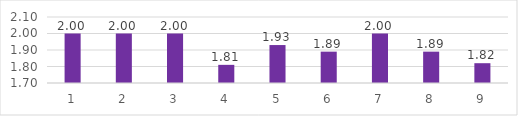
| Category | Series 0 |
|---|---|
| 0 | 2 |
| 1 | 2 |
| 2 | 2 |
| 3 | 1.81 |
| 4 | 1.93 |
| 5 | 1.89 |
| 6 | 2 |
| 7 | 1.89 |
| 8 | 1.82 |